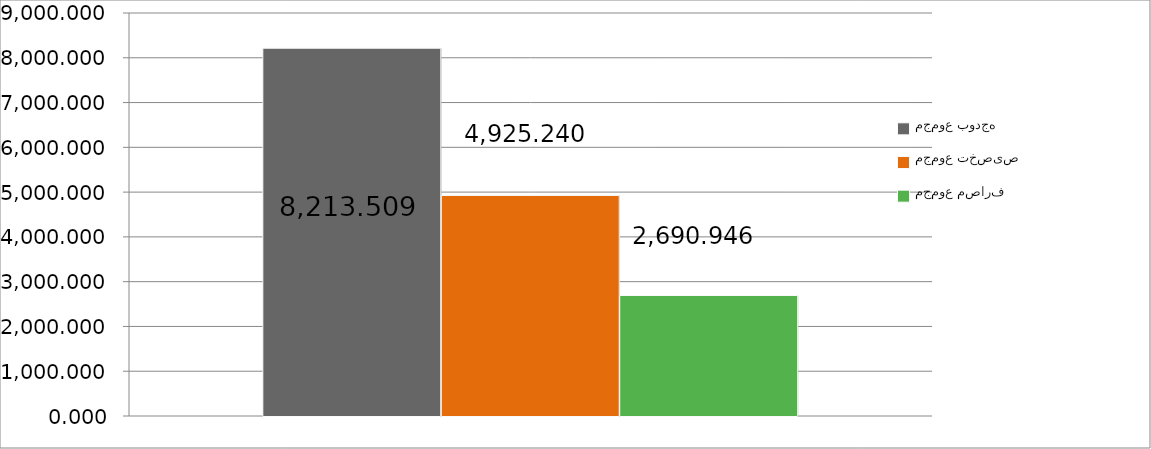
| Category | مجموع بودجه  | مجموع تخصیص | مجموع مصارف |
|---|---|---|---|
| 0 | 8213.509 | 4925.24 | 2690.946 |